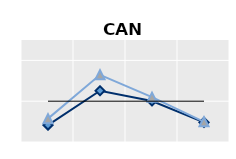
| Category | Foreign-born | Native-born | Series 1 |
|---|---|---|---|
| 15-24 | 0.413 | 0.573 | 1 |
| 25-54 | 1.257 | 1.647 | 1 |
| 55-64 | 1.005 | 1.1 | 1 |
| 65+ | 0.482 | 0.494 | 1 |